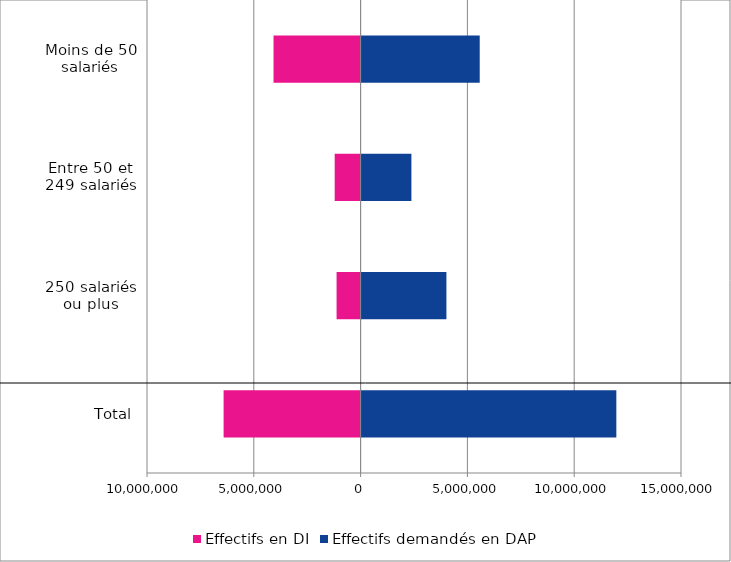
| Category | Effectifs en DI | Effectifs demandés en DAP |
|---|---|---|
| Total | -6413491 | 11972700 |
| 250 salariés ou plus | -1124568 | 4017744 |
| Entre 50 et 249 salariés | -1212444 | 2378386 |
| Moins de 50 salariés | -4076479 | 5576570 |